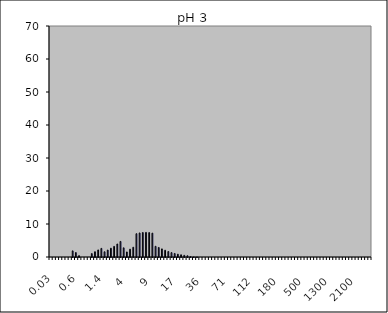
| Category | Maghemite pH 3 1Nb |
|---|---|
| 0.03 | 0 |
| 0.04 | 0 |
| 0.07 | 0 |
| 0.1 | 0 |
| 0.2 | 0 |
| 0.3 | 0 |
| 0.4 | 0 |
| 0.5 | 1.86 |
| 0.6 | 1.35 |
| 0.7 | 0.408 |
| 0.8 | 0 |
| 0.9 | 0 |
| 1.0 | 0 |
| 1.1 | 1.035 |
| 1.2 | 1.597 |
| 1.3 | 2.136 |
| 1.4 | 2.611 |
| 1.6 | 1.583 |
| 1.8 | 2.105 |
| 2.0 | 2.665 |
| 2.2 | 3.222 |
| 2.4 | 3.94 |
| 2.6 | 4.717 |
| 3.0 | 2.783 |
| 4.0 | 1.528 |
| 5.0 | 2.365 |
| 6.0 | 2.957 |
| 6.5 | 7.064 |
| 7.0 | 7.287 |
| 7.5 | 7.419 |
| 8.0 | 7.451 |
| 8.5 | 7.405 |
| 9.0 | 7.23 |
| 10.0 | 3.245 |
| 11.0 | 2.887 |
| 12.0 | 2.461 |
| 13.0 | 2.042 |
| 14.0 | 1.66 |
| 15.0 | 1.334 |
| 16.0 | 1.077 |
| 17.0 | 0.852 |
| 18.0 | 0.674 |
| 19.0 | 0.504 |
| 20.0 | 0.385 |
| 22.0 | 0.118 |
| 25.0 | 0.029 |
| 28.0 | 0.017 |
| 32.0 | 0 |
| 36.0 | 0 |
| 38.0 | 0 |
| 40.0 | 0 |
| 45.0 | 0 |
| 50.0 | 0 |
| 53.0 | 0 |
| 56.0 | 0 |
| 63.0 | 0 |
| 71.0 | 0 |
| 75.0 | 0 |
| 80.0 | 0 |
| 85.0 | 0 |
| 90.0 | 0 |
| 95.0 | 0 |
| 100.0 | 0 |
| 106.0 | 0 |
| 112.0 | 0 |
| 125.0 | 0 |
| 130.0 | 0 |
| 140.0 | 0 |
| 145.0 | 0 |
| 150.0 | 0 |
| 160.0 | 0 |
| 170.0 | 0 |
| 180.0 | 0 |
| 190.0 | 0 |
| 200.0 | 0 |
| 212.0 | 0 |
| 242.0 | 0 |
| 250.0 | 0 |
| 300.0 | 0 |
| 400.0 | 0 |
| 500.0 | 0 |
| 600.0 | 0 |
| 700.0 | 0 |
| 800.0 | 0 |
| 900.0 | 0 |
| 1000.0 | 0 |
| 1100.0 | 0 |
| 1200.0 | 0 |
| 1300.0 | 0 |
| 1400.0 | 0 |
| 1500.0 | 0 |
| 1600.0 | 0 |
| 1700.0 | 0 |
| 1800.0 | 0 |
| 1900.0 | 0 |
| 2000.0 | 0 |
| 2100.0 | 0 |
| 2200.0 | 0 |
| 2300.0 | 0 |
| 2400.0 | 0 |
| 2500.0 | 0 |